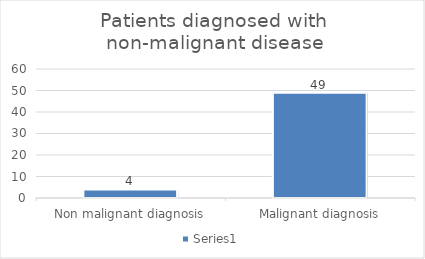
| Category | Series 0 |
|---|---|
| Non malignant diagnosis | 4 |
| Malignant diagnosis | 49 |